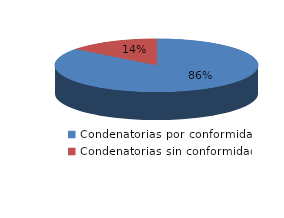
| Category | Series 0 |
|---|---|
| 0 | 1427 |
| 1 | 242 |